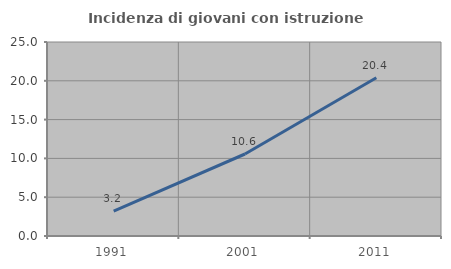
| Category | Incidenza di giovani con istruzione universitaria |
|---|---|
| 1991.0 | 3.196 |
| 2001.0 | 10.567 |
| 2011.0 | 20.401 |